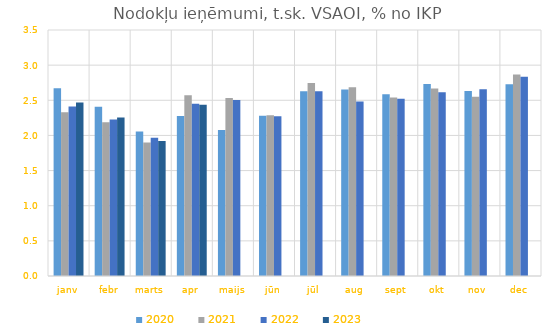
| Category | 2020 | 2021 | 2022 | 2023 |
|---|---|---|---|---|
| janv | 2.673 | 2.331 | 2.41 | 2.468 |
| febr | 2.407 | 2.188 | 2.228 | 2.254 |
| marts | 2.056 | 1.899 | 1.968 | 1.921 |
| apr | 2.276 | 2.573 | 2.451 | 2.438 |
| maijs | 2.077 | 2.531 | 2.504 | 0 |
| jūn | 2.28 | 2.289 | 2.275 | 0 |
| jūl | 2.63 | 2.746 | 2.629 | 0 |
| aug | 2.654 | 2.685 | 2.482 | 0 |
| sept | 2.586 | 2.539 | 2.522 | 0 |
| okt | 2.733 | 2.667 | 2.614 | 0 |
| nov | 2.631 | 2.55 | 2.657 | 0 |
| dec | 2.728 | 2.867 | 2.834 | 0 |